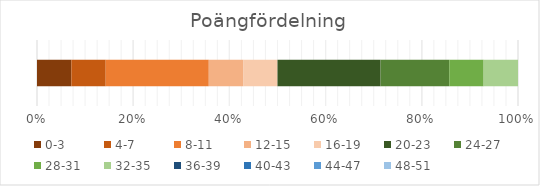
| Category | 0-3 | 4-7 | 8-11 | 12-15 | 16-19 | 20-23 | 24-27 | 28-31 | 32-35 | 36-39 | 40-43 | 44-47 | 48-51 |
|---|---|---|---|---|---|---|---|---|---|---|---|---|---|
| Antal
studenter | 1 | 1 | 3 | 1 | 1 | 3 | 2 | 1 | 1 | 0 | 0 | 0 | 0 |